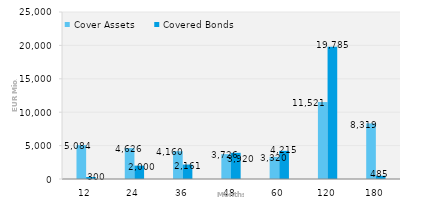
| Category | Cover Assets | Covered Bonds |
|---|---|---|
| 12.0 | 5084.115 | 300 |
| 24.0 | 4626.49 | 2000 |
| 36.0 | 4159.52 | 2161 |
| 48.0 | 3725.604 | 3920 |
| 60.0 | 3319.56 | 4215 |
| 120.0 | 11520.529 | 19785 |
| 180.0 | 8319.299 | 485 |